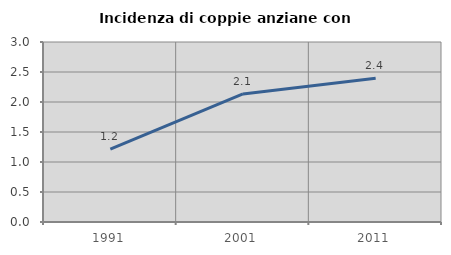
| Category | Incidenza di coppie anziane con figli |
|---|---|
| 1991.0 | 1.213 |
| 2001.0 | 2.135 |
| 2011.0 | 2.396 |